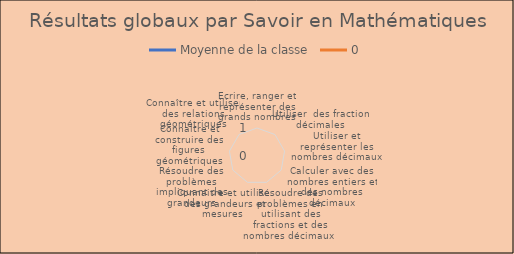
| Category | Moyenne de la classe | 0 |
|---|---|---|
| Ecrire, ranger et représenter des grands nombres | 0 |  |
| Utiliser  des fractions décimales  | 0 |  |
| Utiliser et représenter les nombres décimaux | 0 |  |
| Calculer avec des nombres entiers et des nombres décimaux | 0 |  |
| Résoudre des problèmes en utilisant des fractions et des nombres décimaux  | 0 |  |
| Connaitre et utiliser des grandeurs et mesures  | 0 |  |
| Résoudre des problèmes impliquant des grandeurs | 0 |  |
| Connaitre et construire des figures géométriques | 0 |  |
| Connaître et utiliser des relations géométriques | 0 |  |